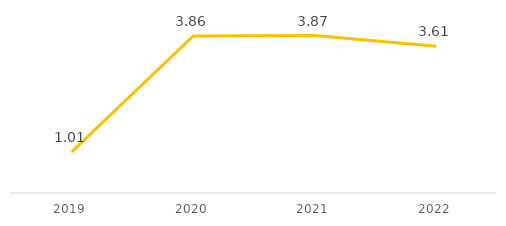
| Category | Series 0 |
|---|---|
| 2019.0 | 1.01 |
| 2020.0 | 3.86 |
| 2021.0 | 3.87 |
| 2022.0 | 3.61 |